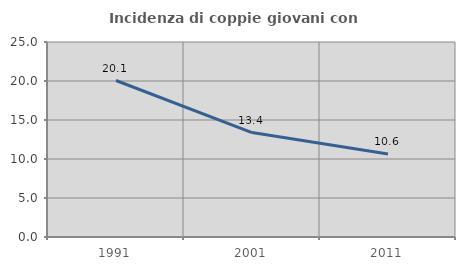
| Category | Incidenza di coppie giovani con figli |
|---|---|
| 1991.0 | 20.062 |
| 2001.0 | 13.392 |
| 2011.0 | 10.641 |